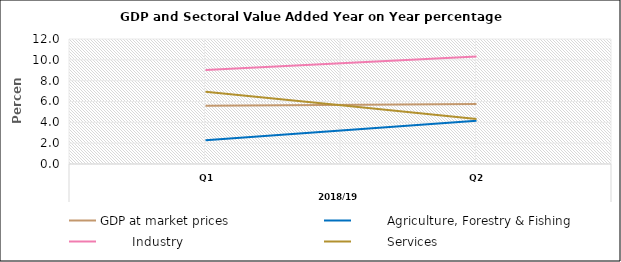
| Category | GDP at market prices |         Agriculture, Forestry & Fishing |         Industry |         Services |
|---|---|---|---|---|
| 0 | 5.598 | 2.279 | 9.036 | 6.937 |
| 1 | 5.756 | 4.154 | 10.331 | 4.322 |